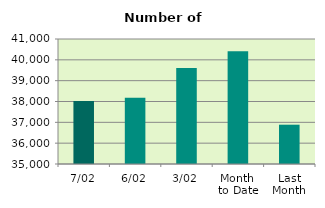
| Category | Series 0 |
|---|---|
| 7/02 | 38020 |
| 6/02 | 38178 |
| 3/02 | 39612 |
| Month 
to Date | 40408 |
| Last
Month | 36886.364 |